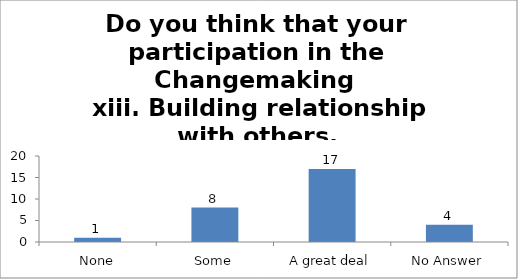
| Category | Do you think that your participation in the Changemaking 
 xiii. Building relationship with others. |
|---|---|
| None | 1 |
| Some | 8 |
| A great deal | 17 |
| No Answer | 4 |